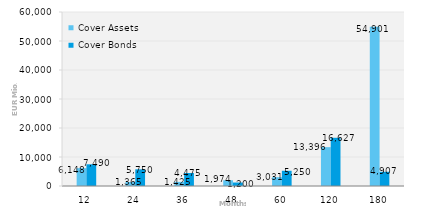
| Category | Cover Assets | Cover Bonds |
|---|---|---|
| 12.0 | 6147.88 | 7490 |
| 24.0 | 1364.96 | 5750 |
| 36.0 | 1424.74 | 4475 |
| 48.0 | 1974.35 | 1200 |
| 60.0 | 3030.5 | 5250 |
| 120.0 | 13396.43 | 16627.2 |
| 180.0 | 54901.24 | 4907 |